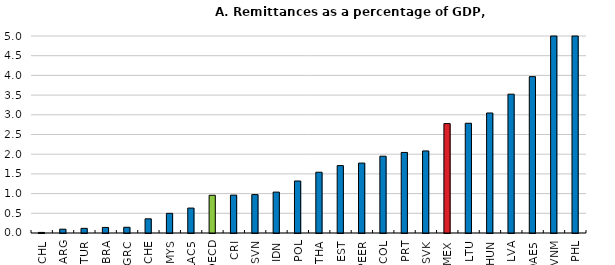
| Category | Series 0 |
|---|---|
| CHL | 0.015 |
| ARG | 0.097 |
| TUR | 0.118 |
| BRA | 0.141 |
| GRC | 0.145 |
| CHE | 0.36 |
| MYS | 0.499 |
| LAC5 | 0.633 |
| OECD | 0.958 |
| CRI | 0.961 |
| SVN | 0.974 |
| IDN | 1.038 |
| POL | 1.32 |
| THA | 1.543 |
| EST | 1.711 |
| PEER | 1.775 |
| COL | 1.949 |
| PRT | 2.045 |
| SVK | 2.083 |
| MEX | 2.777 |
| LTU | 2.785 |
| HUN | 3.046 |
| LVA | 3.523 |
| DAE5 | 3.969 |
| VNM | 6.618 |
| PHL | 10.145 |